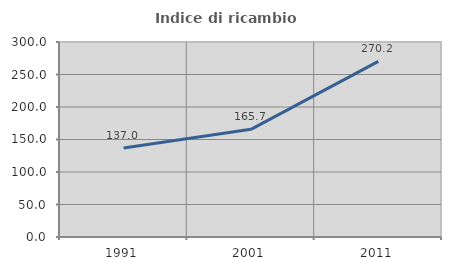
| Category | Indice di ricambio occupazionale  |
|---|---|
| 1991.0 | 136.973 |
| 2001.0 | 165.657 |
| 2011.0 | 270.161 |